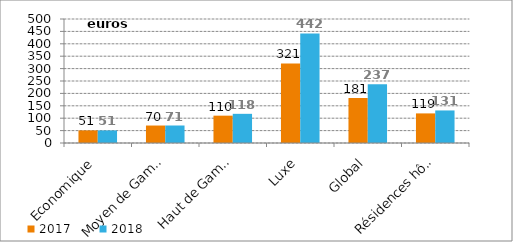
| Category | 2017 | 2018 |
|---|---|---|
| Economique | 50.751 | 50.628 |
| Moyen de Gamme | 70.457 | 70.564 |
| Haut de Gamme | 110.222 | 117.617 |
| Luxe | 320.72 | 441.767 |
| Global | 181.404 | 236.614 |
| Résidences hôtelières | 119.342 | 131.254 |